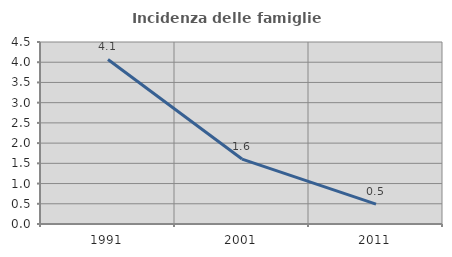
| Category | Incidenza delle famiglie numerose |
|---|---|
| 1991.0 | 4.069 |
| 2001.0 | 1.605 |
| 2011.0 | 0.49 |